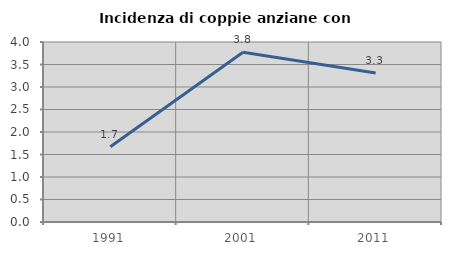
| Category | Incidenza di coppie anziane con figli |
|---|---|
| 1991.0 | 1.674 |
| 2001.0 | 3.774 |
| 2011.0 | 3.309 |